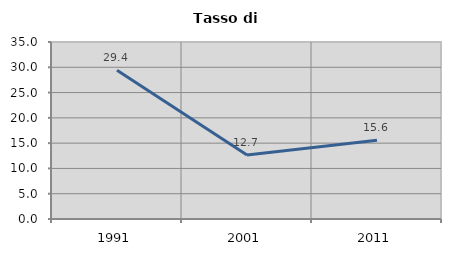
| Category | Tasso di disoccupazione   |
|---|---|
| 1991.0 | 29.412 |
| 2001.0 | 12.676 |
| 2011.0 | 15.578 |